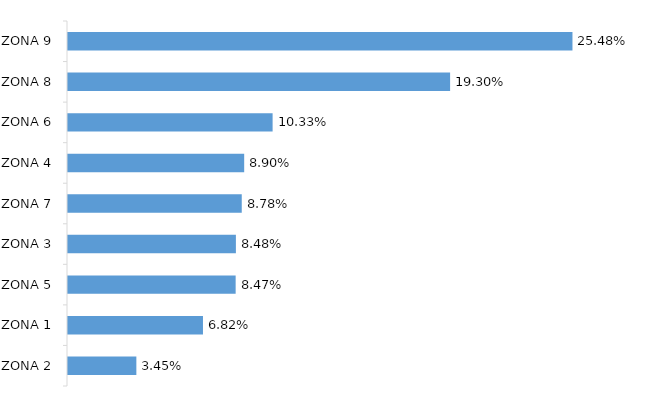
| Category | Profesionales de la Salud |
|---|---|
| ZONA 9 | 0.255 |
| ZONA 8 | 0.193 |
| ZONA 6 | 0.103 |
| ZONA 4 | 0.089 |
| ZONA 7 | 0.088 |
| ZONA 3 | 0.085 |
| ZONA 5 | 0.085 |
| ZONA 1 | 0.068 |
| ZONA 2 | 0.035 |